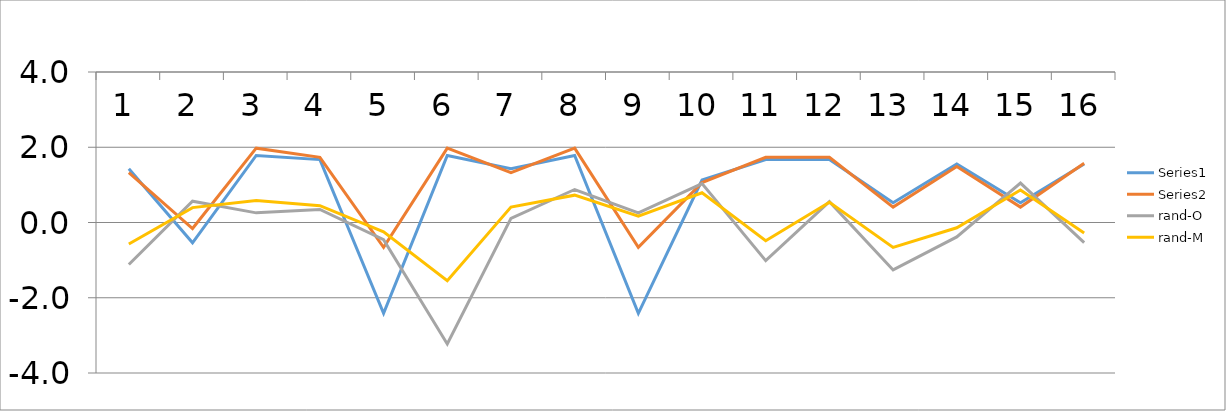
| Category | Series 0 | Series 1 | rand-O | rand-M |
|---|---|---|---|---|
| 0 | 1.426 | 1.323 | -1.118 | -0.571 |
| 1 | -0.541 | -0.16 | 0.566 | 0.396 |
| 2 | 1.781 | 1.976 | 0.256 | 0.587 |
| 3 | 1.672 | 1.733 | 0.347 | 0.448 |
| 4 | -2.415 | -0.659 | -0.458 | -0.248 |
| 5 | 1.781 | 1.976 | -3.227 | -1.545 |
| 6 | 1.426 | 1.323 | 0.108 | 0.41 |
| 7 | 1.781 | 1.976 | 0.877 | 0.727 |
| 8 | -2.415 | -0.659 | 0.256 | 0.17 |
| 9 | 1.129 | 1.059 | 1.035 | 0.79 |
| 10 | 1.672 | 1.733 | -1.014 | -0.487 |
| 11 | 1.672 | 1.733 | 0.552 | 0.538 |
| 12 | 0.524 | 0.409 | -1.26 | -0.662 |
| 13 | 1.555 | 1.486 | -0.383 | -0.14 |
| 14 | 0.524 | 0.409 | 1.049 | 0.866 |
| 15 | 1.555 | 1.575 | -0.537 | -0.279 |